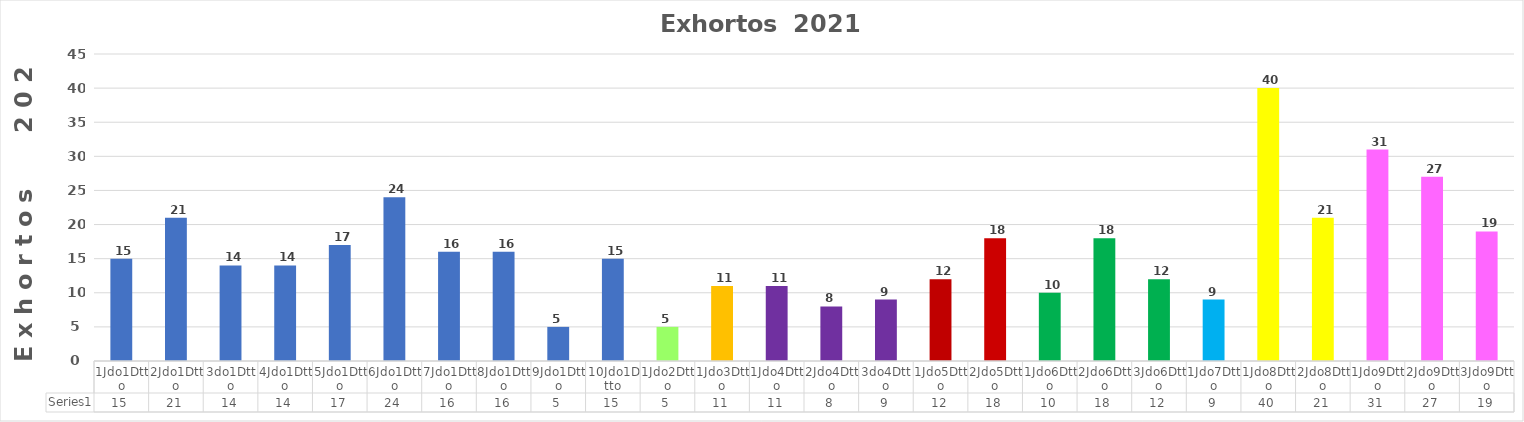
| Category | Series 0 |
|---|---|
| 1Jdo1Dtto | 15 |
| 2Jdo1Dtto | 21 |
| 3do1Dtto | 14 |
| 4Jdo1Dtto | 14 |
| 5Jdo1Dtto | 17 |
| 6Jdo1Dtto | 24 |
| 7Jdo1Dtto | 16 |
| 8Jdo1Dtto | 16 |
| 9Jdo1Dtto | 5 |
| 10Jdo1Dtto | 15 |
| 1Jdo2Dtto | 5 |
| 1Jdo3Dtto | 11 |
| 1Jdo4Dtto | 11 |
| 2Jdo4Dtto | 8 |
| 3do4Dtto | 9 |
| 1Jdo5Dtto | 12 |
| 2Jdo5Dtto | 18 |
| 1Jdo6Dtto | 10 |
| 2Jdo6Dtto | 18 |
| 3Jdo6Dtto | 12 |
| 1Jdo7Dtto | 9 |
| 1Jdo8Dtto | 40 |
| 2Jdo8Dtto | 21 |
| 1Jdo9Dtto | 31 |
| 2Jdo9Dtto | 27 |
| 3Jdo9Dtto | 19 |